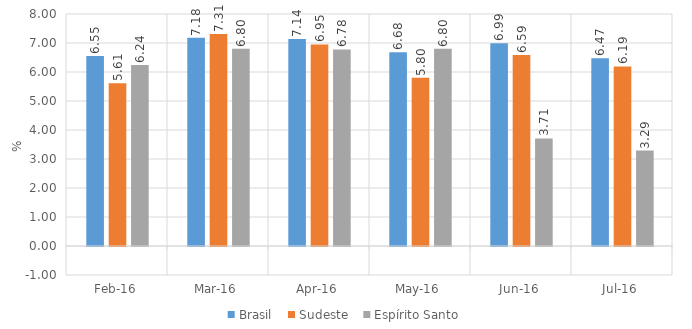
| Category | Brasil | Sudeste | Espírito Santo |
|---|---|---|---|
| 2016-02-01 | 6.55 | 5.61 | 6.24 |
| 2016-03-01 | 7.18 | 7.31 | 6.8 |
| 2016-04-01 | 7.14 | 6.95 | 6.78 |
| 2016-05-01 | 6.68 | 5.8 | 6.8 |
| 2016-06-01 | 6.99 | 6.59 | 3.71 |
| 2016-07-01 | 6.47 | 6.19 | 3.29 |